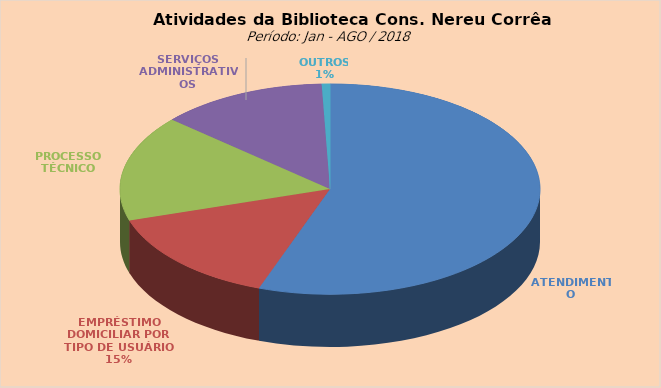
| Category | Series 0 |
|---|---|
| ATENDIMENTO | 9155 |
| EMPRÉSTIMO DOMICILIAR POR TIPO DE USUÁRIO | 2425 |
| PROCESSO TÉCNICO | 2687 |
| SERVIÇOS ADMINISTRATIVOS | 2128 |
| OUTROS | 105 |